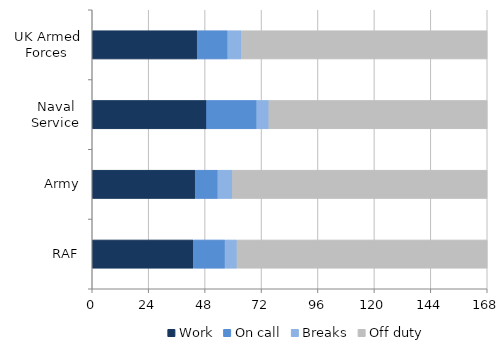
| Category | Work | On call | Breaks | Off duty |
|---|---|---|---|---|
| UK Armed Forces | 44.652 | 13.018 | 5.72 | 104.56 |
| Naval Service | 48.666 | 21.331 | 5.176 | 92.795 |
| Army | 43.803 | 9.682 | 6.177 | 108.267 |
| RAF | 42.993 | 13.531 | 5.086 | 106.375 |